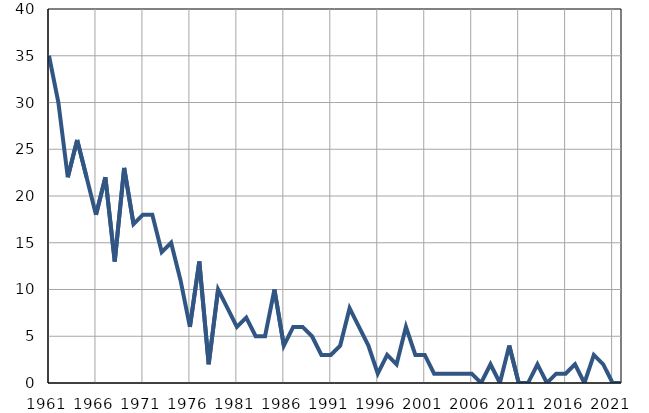
| Category | Умрла 
одојчад |
|---|---|
| 1961.0 | 35 |
| 1962.0 | 30 |
| 1963.0 | 22 |
| 1964.0 | 26 |
| 1965.0 | 22 |
| 1966.0 | 18 |
| 1967.0 | 22 |
| 1968.0 | 13 |
| 1969.0 | 23 |
| 1970.0 | 17 |
| 1971.0 | 18 |
| 1972.0 | 18 |
| 1973.0 | 14 |
| 1974.0 | 15 |
| 1975.0 | 11 |
| 1976.0 | 6 |
| 1977.0 | 13 |
| 1978.0 | 2 |
| 1979.0 | 10 |
| 1980.0 | 8 |
| 1981.0 | 6 |
| 1982.0 | 7 |
| 1983.0 | 5 |
| 1984.0 | 5 |
| 1985.0 | 10 |
| 1986.0 | 4 |
| 1987.0 | 6 |
| 1988.0 | 6 |
| 1989.0 | 5 |
| 1990.0 | 3 |
| 1991.0 | 3 |
| 1992.0 | 4 |
| 1993.0 | 8 |
| 1994.0 | 6 |
| 1995.0 | 4 |
| 1996.0 | 1 |
| 1997.0 | 3 |
| 1998.0 | 2 |
| 1999.0 | 6 |
| 2000.0 | 3 |
| 2001.0 | 3 |
| 2002.0 | 1 |
| 2003.0 | 1 |
| 2004.0 | 1 |
| 2005.0 | 1 |
| 2006.0 | 1 |
| 2007.0 | 0 |
| 2008.0 | 2 |
| 2009.0 | 0 |
| 2010.0 | 4 |
| 2011.0 | 0 |
| 2012.0 | 0 |
| 2013.0 | 2 |
| 2014.0 | 0 |
| 2015.0 | 1 |
| 2016.0 | 1 |
| 2017.0 | 2 |
| 2018.0 | 0 |
| 2019.0 | 3 |
| 2020.0 | 2 |
| 2021.0 | 0 |
| 2022.0 | 0 |